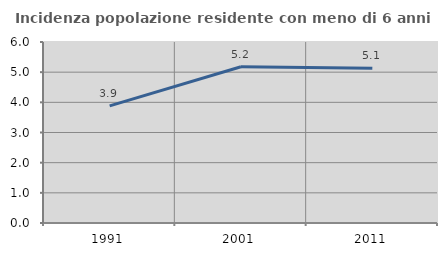
| Category | Incidenza popolazione residente con meno di 6 anni |
|---|---|
| 1991.0 | 3.884 |
| 2001.0 | 5.179 |
| 2011.0 | 5.127 |